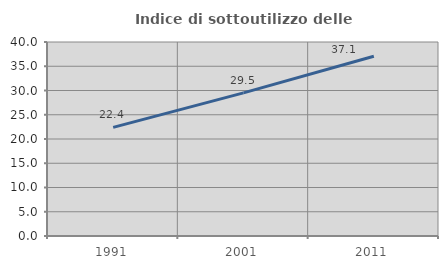
| Category | Indice di sottoutilizzo delle abitazioni  |
|---|---|
| 1991.0 | 22.397 |
| 2001.0 | 29.508 |
| 2011.0 | 37.064 |